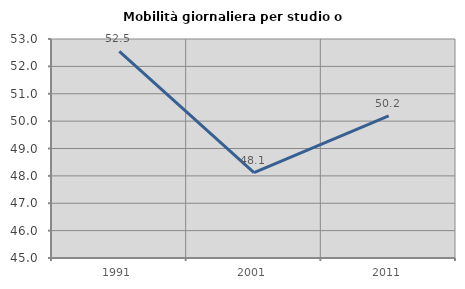
| Category | Mobilità giornaliera per studio o lavoro |
|---|---|
| 1991.0 | 52.548 |
| 2001.0 | 48.123 |
| 2011.0 | 50.194 |